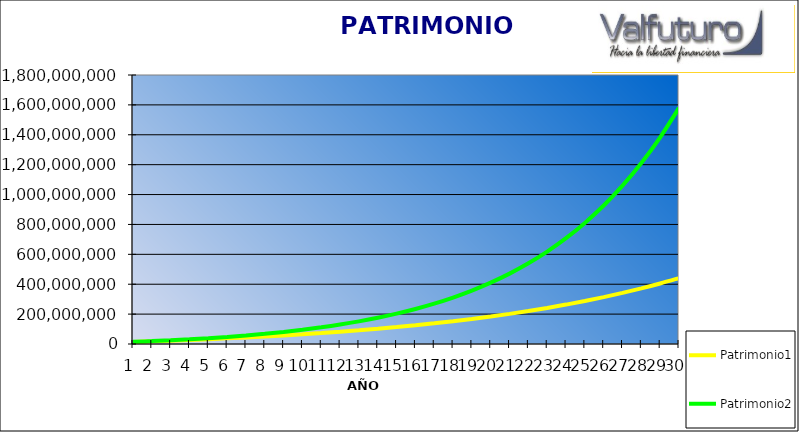
| Category | Patrimonio1 | Patrimonio2 |
|---|---|---|
| 0 | 13800000 | 14400000 |
| 1 | 17904000 | 19416000 |
| 2 | 22336320 | 25134240 |
| 3 | 27123225.6 | 31653033.6 |
| 4 | 32293083.648 | 39084458.304 |
| 5 | 37876530.34 | 47556282.467 |
| 6 | 43906652.767 | 57214162.012 |
| 7 | 50419184.988 | 68224144.694 |
| 8 | 57452719.787 | 80775524.951 |
| 9 | 65048937.37 | 95084098.444 |
| 10 | 73252852.36 | 111395872.226 |
| 11 | 82113080.549 | 129991294.337 |
| 12 | 91682126.993 | 151190075.545 |
| 13 | 102016697.152 | 175356686.121 |
| 14 | 113178032.924 | 202906622.178 |
| 15 | 125232275.558 | 234313549.283 |
| 16 | 138250857.603 | 270117446.182 |
| 17 | 152310926.211 | 310933888.648 |
| 18 | 167495800.308 | 357464633.059 |
| 19 | 183895464.333 | 410509681.687 |
| 20 | 201607101.479 | 470981037.123 |
| 21 | 220735669.598 | 539918382.32 |
| 22 | 241394523.166 | 618506955.845 |
| 23 | 263706085.019 | 708097929.663 |
| 24 | 287802571.82 | 810231639.816 |
| 25 | 313826777.566 | 926664069.391 |
| 26 | 341932919.771 | 1059397039.105 |
| 27 | 372287553.353 | 1210712624.58 |
| 28 | 405070557.621 | 1383212392.021 |
| 29 | 440476202.231 | 1579862126.904 |